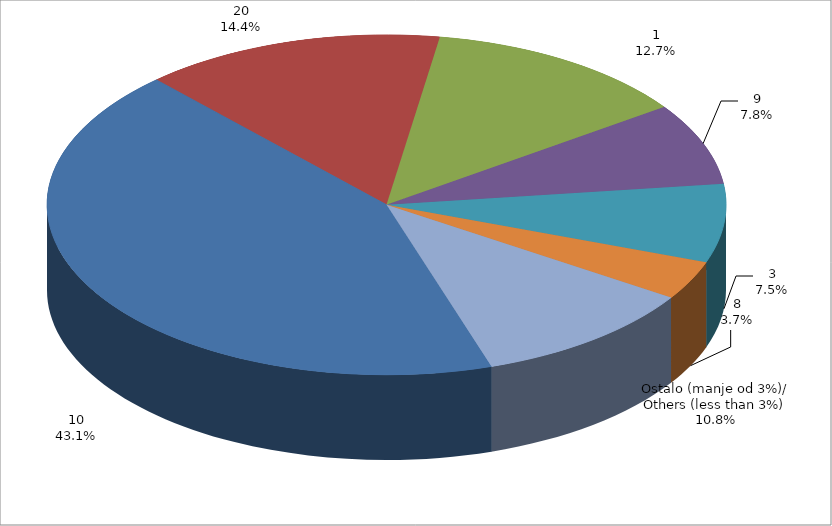
| Category | Series 0 |
|---|---|
| 10 | 27982366.108 |
| 20 | 9317019.67 |
| 1 | 8243849.57 |
| 9 | 5058787.868 |
| 3 | 4833865.825 |
| 8 | 2405530.604 |
| Ostalo (manje od 3%)/
Others (less than 3%) | 7014269.611 |